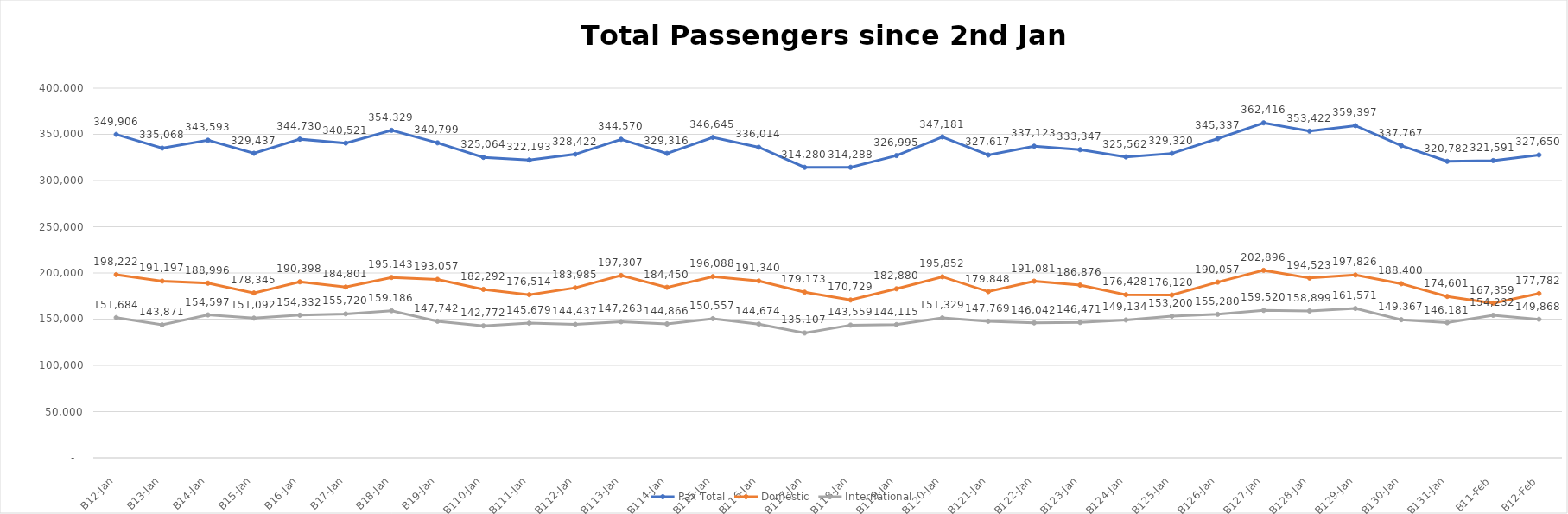
| Category | Pax Total |  Domestic  |  International  |
|---|---|---|---|
| 2023-01-02 | 349906 | 198222 | 151684 |
| 2023-01-03 | 335068 | 191197 | 143871 |
| 2023-01-04 | 343593 | 188996 | 154597 |
| 2023-01-05 | 329437 | 178345 | 151092 |
| 2023-01-06 | 344730 | 190398 | 154332 |
| 2023-01-07 | 340521 | 184801 | 155720 |
| 2023-01-08 | 354329 | 195143 | 159186 |
| 2023-01-09 | 340799 | 193057 | 147742 |
| 2023-01-10 | 325064 | 182292 | 142772 |
| 2023-01-11 | 322193 | 176514 | 145679 |
| 2023-01-12 | 328422 | 183985 | 144437 |
| 2023-01-13 | 344570 | 197307 | 147263 |
| 2023-01-14 | 329316 | 184450 | 144866 |
| 2023-01-15 | 346645 | 196088 | 150557 |
| 2023-01-16 | 336014 | 191340 | 144674 |
| 2023-01-17 | 314280 | 179173 | 135107 |
| 2023-01-18 | 314288 | 170729 | 143559 |
| 2023-01-19 | 326995 | 182880 | 144115 |
| 2023-01-20 | 347181 | 195852 | 151329 |
| 2023-01-21 | 327617 | 179848 | 147769 |
| 2023-01-22 | 337123 | 191081 | 146042 |
| 2023-01-23 | 333347 | 186876 | 146471 |
| 2023-01-24 | 325562 | 176428 | 149134 |
| 2023-01-25 | 329320 | 176120 | 153200 |
| 2023-01-26 | 345337 | 190057 | 155280 |
| 2023-01-27 | 362416 | 202896 | 159520 |
| 2023-01-28 | 353422 | 194523 | 158899 |
| 2023-01-29 | 359397 | 197826 | 161571 |
| 2023-01-30 | 337767 | 188400 | 149367 |
| 2023-01-31 | 320782 | 174601 | 146181 |
| 2023-02-01 | 321591 | 167359 | 154232 |
| 2023-02-02 | 327650 | 177782 | 149868 |